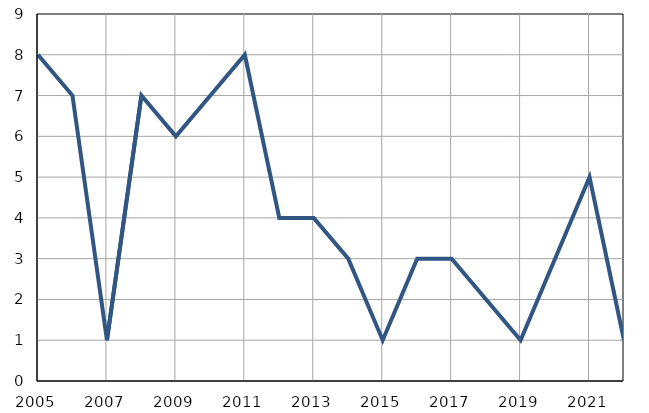
| Category | Infants
deaths |
|---|---|
| 2005.0 | 8 |
| 2006.0 | 7 |
| 2007.0 | 1 |
| 2008.0 | 7 |
| 2009.0 | 6 |
| 2010.0 | 7 |
| 2011.0 | 8 |
| 2012.0 | 4 |
| 2013.0 | 4 |
| 2014.0 | 3 |
| 2015.0 | 1 |
| 2016.0 | 3 |
| 2017.0 | 3 |
| 2018.0 | 2 |
| 2019.0 | 1 |
| 2020.0 | 3 |
| 2021.0 | 5 |
| 2022.0 | 1 |